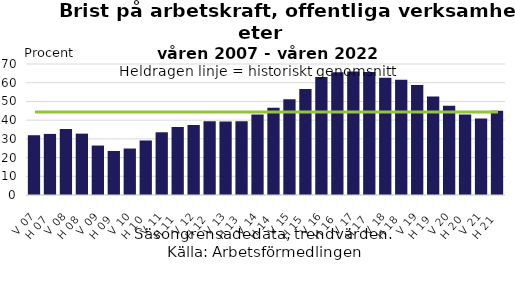
| Category | Series 0 |
|---|---|
| V 07 | 31.94 |
| H 07 | 32.65 |
| V 08 | 35.33 |
| H 08 | 32.79 |
| V 09 | 26.43 |
| H 09 | 23.52 |
| V 10 | 24.83 |
| H 10 | 29.14 |
| V 11 | 33.52 |
| H 11 | 36.27 |
| V 12 | 37.47 |
| H 12 | 39.41 |
| V 13 | 39.27 |
| H 13 | 39.47 |
| V 14 | 43.08 |
| H 14 | 46.66 |
| V 15 | 51.14 |
| H 15 | 56.63 |
| V 16 | 63.08 |
| H 16 | 65.63 |
| V 17 | 65.93 |
| H 17 | 65.76 |
| V 18 | 62.69 |
| H 18 | 61.64 |
| V 19 | 58.81 |
| H 19 | 52.68 |
| V 20 | 47.75 |
| H 20 | 43 |
| V 21 | 40.9 |
| H 21 | 44.96 |